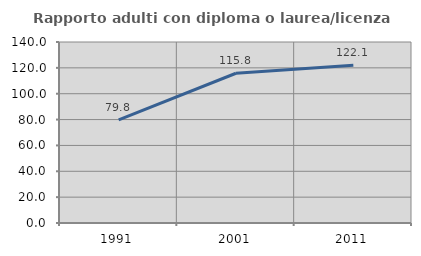
| Category | Rapporto adulti con diploma o laurea/licenza media  |
|---|---|
| 1991.0 | 79.839 |
| 2001.0 | 115.827 |
| 2011.0 | 122.069 |